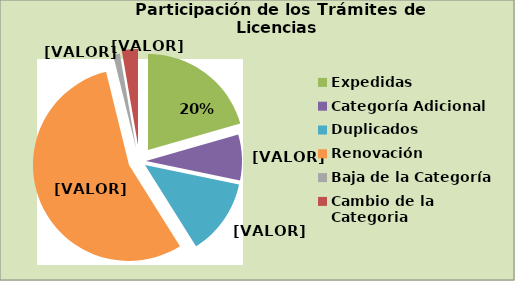
| Category | Series 0 |
|---|---|
| Expedidas | 20.544 |
| Categoría Adicional | 7.695 |
| Duplicados | 12.854 |
| Renovación | 55.062 |
| Baja de la Categoría | 1.142 |
| Cambio de la Categoria | 2.704 |